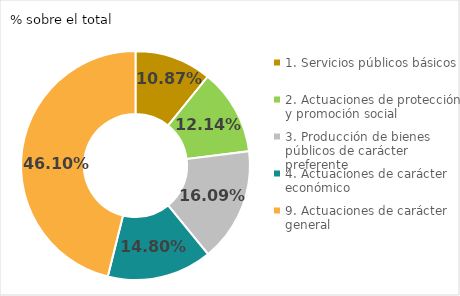
| Category | Series 0 |
|---|---|
| Red local de carreteras | 0.461 |
| Obras y mantenimiento de recintos | 0.208 |
| Vías Azules Barcelona | 0.067 |
| Recursos informáticos | 0.046 |
| Otras inversiones | 0.219 |